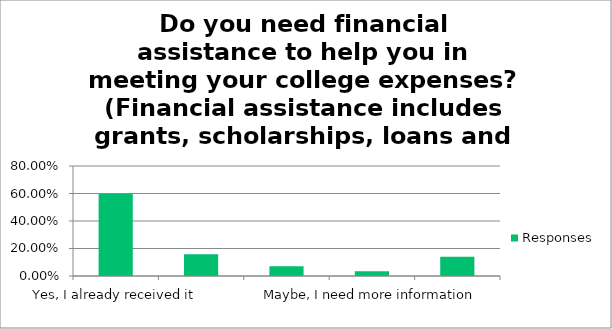
| Category | Responses |
|---|---|
| Yes, I already received it | 0.596 |
| Yes, I need it and I applied but wasn't eligible | 0.158 |
| Yes , I need it but haven't applied | 0.07 |
| Maybe, I need more information | 0.035 |
| No, I do not need financial aid | 0.14 |